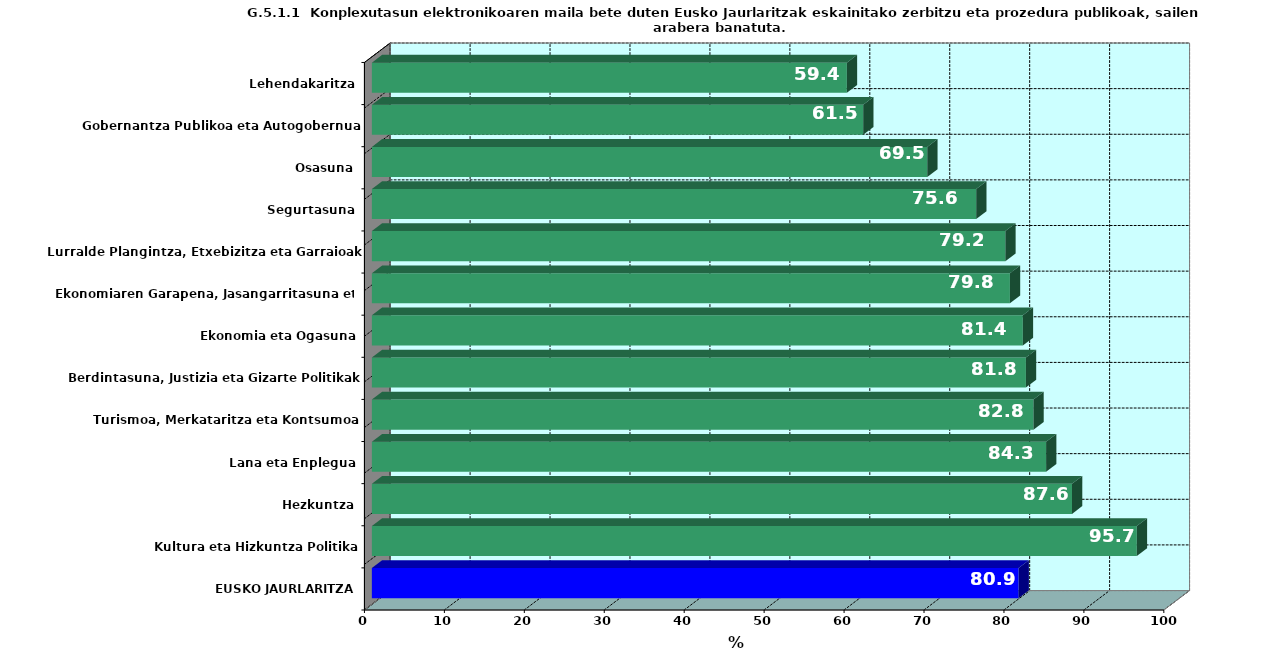
| Category | Series 0 |
|---|---|
| EUSKO JAURLARITZA | 80.905 |
| Kultura eta Hizkuntza Politika | 95.692 |
| Hezkuntza | 87.584 |
| Lana eta Enplegua | 84.343 |
| Turismoa, Merkataritza eta Kontsumoa | 82.759 |
| Berdintasuna, Justizia eta Gizarte Politikak | 81.818 |
| Ekonomia eta Ogasuna | 81.433 |
| Ekonomiaren Garapena, Jasangarritasuna eta Ingurumena | 79.817 |
| Lurralde Plangintza, Etxebizitza eta Garraioak | 79.245 |
| Segurtasuna | 75.6 |
| Osasuna | 69.478 |
| Gobernantza Publikoa eta Autogobernua | 61.463 |
| Lehendakaritza | 59.42 |